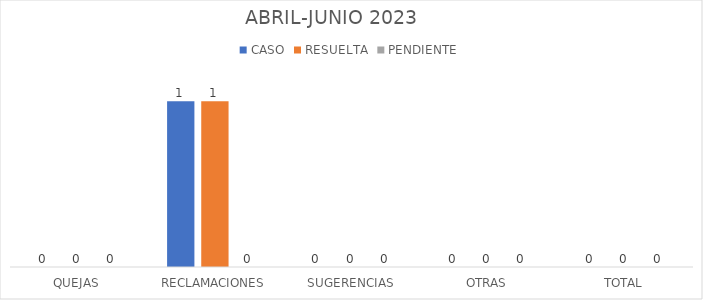
| Category | CASO | RESUELTA | PENDIENTE |
|---|---|---|---|
| QUEJAS | 0 | 0 | 0 |
| RECLAMACIONES | 1 | 1 | 0 |
| SUGERENCIAS | 0 | 0 | 0 |
| OTRAS | 0 | 0 | 0 |
| TOTAL | 0 | 0 | 0 |